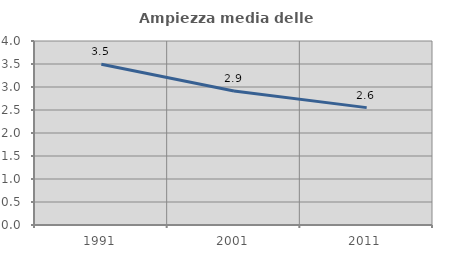
| Category | Ampiezza media delle famiglie |
|---|---|
| 1991.0 | 3.493 |
| 2001.0 | 2.911 |
| 2011.0 | 2.552 |